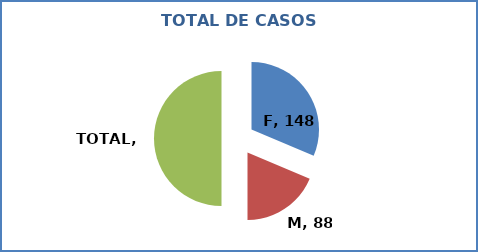
| Category | Series 0 |
|---|---|
| F | 148 |
| M | 88 |
| TOTAL | 236 |